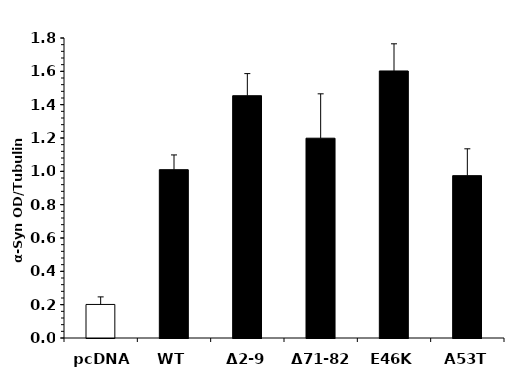
| Category | Series 0 |
|---|---|
| pcDNA | 0.201 |
| WT | 1.01 |
| Δ2-9 | 1.454 |
| Δ71-82 | 1.199 |
| E46K | 1.602 |
| A53T | 0.974 |